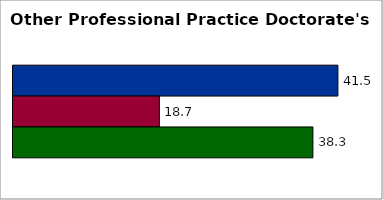
| Category | 50 states and D.C. | SREB states | State |
|---|---|---|---|
| 0 | 41.537 | 18.711 | 38.339 |